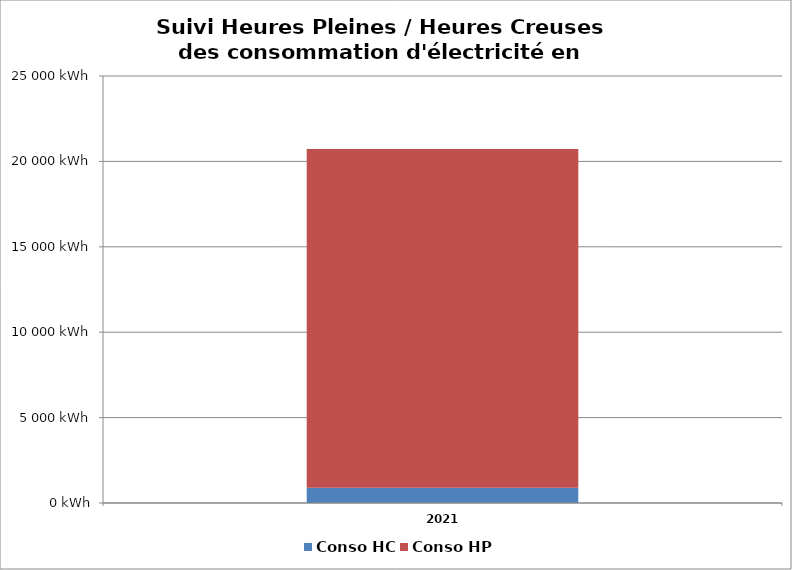
| Category | Conso HC | Conso HP |
|---|---|---|
| 2021 | 900 | 19819 |